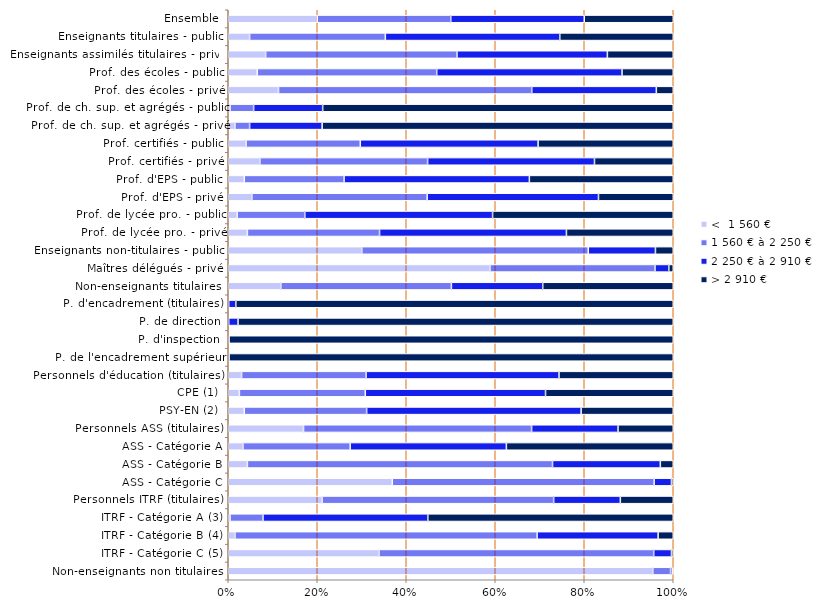
| Category | <  1 560 € | 1 560 € à 2 250 € | 2 250 € à 2 910 € | > 2 910 € |
|---|---|---|---|---|
| Non-enseignants non titulaires | 95.4 | 4 | 0.4 | 0.2 |
| ITRF - Catégorie C (5) | 33.9 | 61.8 | 4 | 0.4 |
| ITRF - Catégorie B (4) | 1.5 | 67.9 | 27.2 | 3.4 |
| ITRF - Catégorie A (3) | 0.4 | 7.4 | 37 | 55.1 |
| Personnels ITRF (titulaires) | 21.1 | 52.1 | 15 | 11.9 |
| ASS - Catégorie C | 36.9 | 58.9 | 3.9 | 0.4 |
| ASS - Catégorie B | 4.3 | 68.5 | 24.2 | 2.9 |
| ASS - Catégorie A | 3.3 | 24.1 | 35.1 | 37.5 |
| Personnels ASS (titulaires) | 16.9 | 51.2 | 19.4 | 12.4 |
| PSY-EN (2) | 3.6 | 27.5 | 48.2 | 20.7 |
| CPE (1) | 2.5 | 28.3 | 40.5 | 28.7 |
| Personnels d'éducation (titulaires) | 3 | 28 | 43.4 | 25.7 |
| P. de l'encadrement supérieur | 0 | 0.1 | 0.1 | 99.8 |
| P. d'inspection | 0 | 0 | 0.2 | 99.8 |
| P. de direction | 0 | 0.1 | 2.1 | 97.8 |
| P. d'encadrement (titulaires) | 0 | 0.1 | 1.6 | 98.3 |
| Non-enseignants titulaires | 11.8 | 38.3 | 20.5 | 29.3 |
| Maîtres délégués - privé | 58.8 | 37.1 | 3.1 | 1 |
| Enseignants non-titulaires - public | 30 | 50.9 | 15.1 | 4 |
| Prof. de lycée pro. - privé | 4.3 | 29.7 | 42 | 24 |
| Prof. de lycée pro. - public | 2 | 15.2 | 42.2 | 40.6 |
| Prof. d'EPS - privé | 5.3 | 39.4 | 38.5 | 16.8 |
| Prof. d'EPS - public | 3.6 | 22.4 | 41.6 | 32.3 |
| Prof. certifiés - privé | 7.1 | 37.7 | 37.5 | 17.7 |
| Prof. certifiés - public | 4 | 25.7 | 40 | 30.4 |
| Prof. de ch. sup. et agrégés - privé | 1.5 | 3.3 | 16.3 | 78.9 |
| Prof. de ch. sup. et agrégés - public | 0.4 | 5.3 | 15.5 | 78.7 |
| Prof. des écoles - privé | 11.3 | 56.9 | 28 | 3.8 |
| Prof. des écoles - public | 6.5 | 40.3 | 41.6 | 11.5 |
| Enseignants assimilés titulaires - privé | 8.4 | 43 | 33.8 | 14.8 |
| Enseignants titulaires - public | 4.8 | 30.5 | 39.2 | 25.5 |
| Ensemble | 20 | 30 | 30 | 20 |